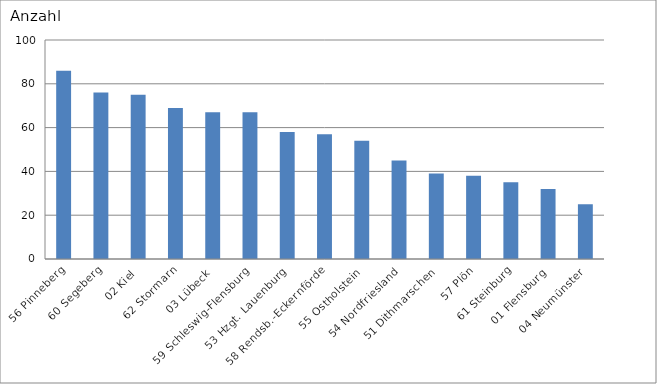
| Category | 56 Pinneberg 60 Segeberg 02 Kiel 62 Stormarn 03 Lübeck 59 Schleswig-Flensburg 53 Hzgt. Lauenburg 58 Rendsb.-Eckernförde 55 Ostholstein 54 Nordfriesland 51 Dithmarschen 57 Plön 61 Steinburg 01 Flensburg 04 Neumünster |
|---|---|
| 56 Pinneberg | 86 |
| 60 Segeberg | 76 |
| 02 Kiel | 75 |
| 62 Stormarn | 69 |
| 03 Lübeck | 67 |
| 59 Schleswig-Flensburg | 67 |
| 53 Hzgt. Lauenburg | 58 |
| 58 Rendsb.-Eckernförde | 57 |
| 55 Ostholstein | 54 |
| 54 Nordfriesland | 45 |
| 51 Dithmarschen | 39 |
| 57 Plön | 38 |
| 61 Steinburg | 35 |
| 01 Flensburg | 32 |
| 04 Neumünster | 25 |